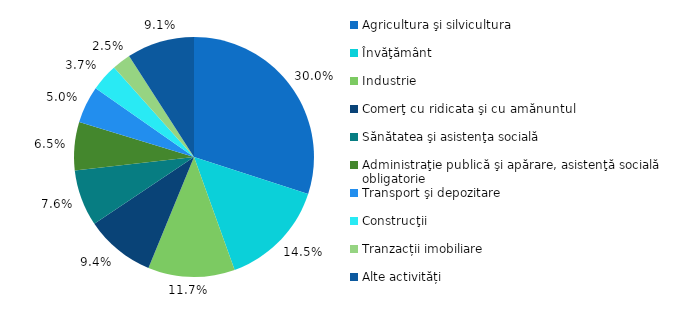
| Category | Series 0 |
|---|---|
| Agricultura şi silvicultura | 0.3 |
| Învăţământ | 0.145 |
| Industrie | 0.117 |
| Comerţ cu ridicata şi cu amănuntul | 0.094 |
| Sănătatea şi asistenţa socială | 0.076 |
| Administraţie publică şi apărare, asistenţă socială obligatorie | 0.065 |
| Transport şi depozitare | 0.05 |
| Construcţii | 0.037 |
| Tranzacții imobiliare | 0.025 |
| Alte activități | 0.091 |